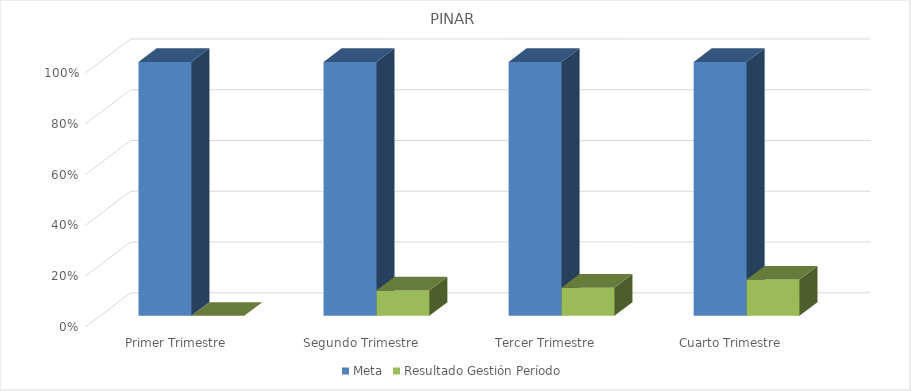
| Category | Meta | Resultado Gestión Período |
|---|---|---|
| Primer Trimestre | 1 | 0 |
| Segundo Trimestre | 1 | 0.1 |
| Tercer Trimestre | 1 | 0.111 |
| Cuarto Trimestre | 1 | 0.143 |